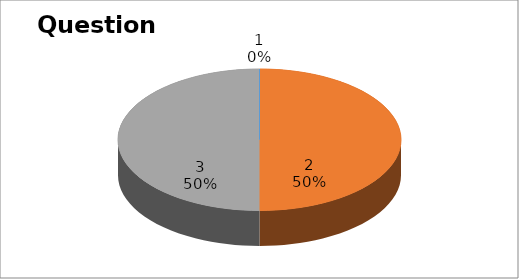
| Category | Series 0 |
|---|---|
| 0 | 0 |
| 1 | 9 |
| 2 | 9 |